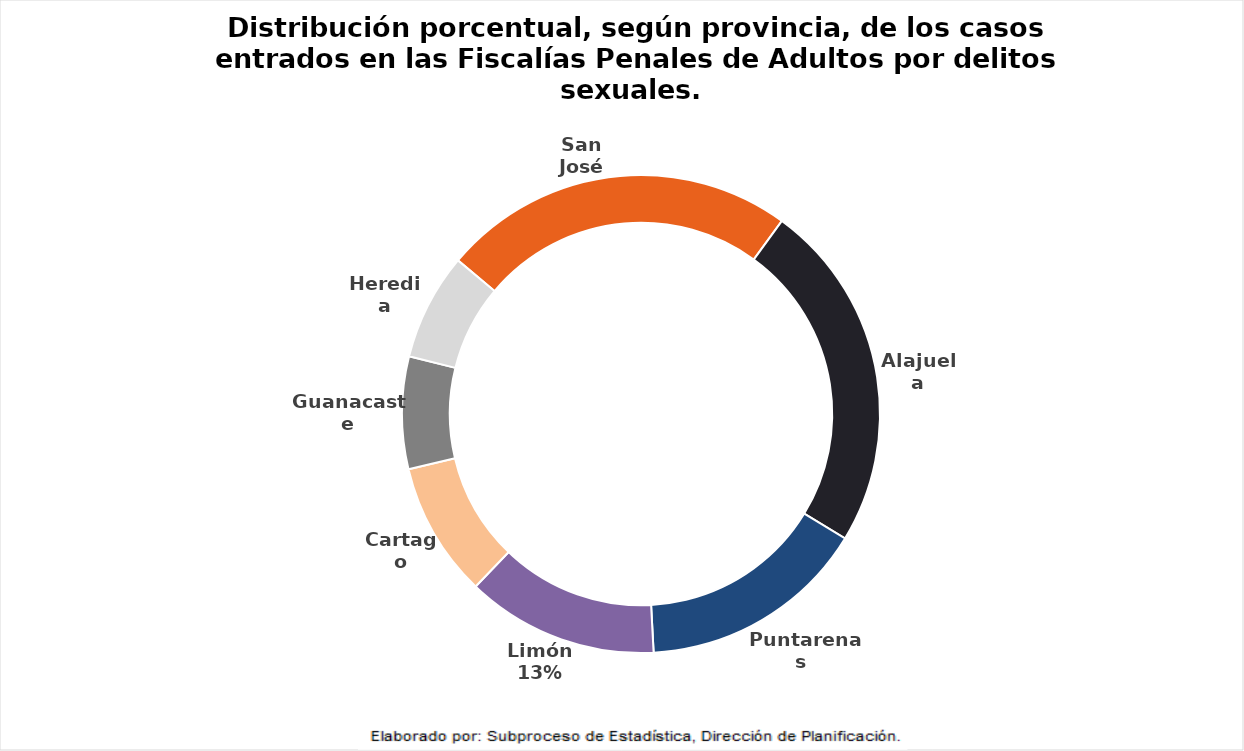
| Category | Delitos Sexuales |
|---|---|
| San José | 2369 |
| Alajuela | 2345 |
| Puntarenas  | 1529 |
| Limón | 1288 |
| Cartago | 903 |
| Guanacaste | 752 |
| Heredia | 716 |